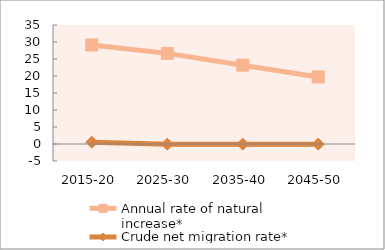
| Category | Annual rate of natural increase* | Crude net migration rate* |
|---|---|---|
| 2015-20 | 29.128 | 0.532 |
| 2025-30 | 26.655 | -0.061 |
| 2035-40 | 23.174 | -0.048 |
| 2045-50 | 19.724 | -0.039 |